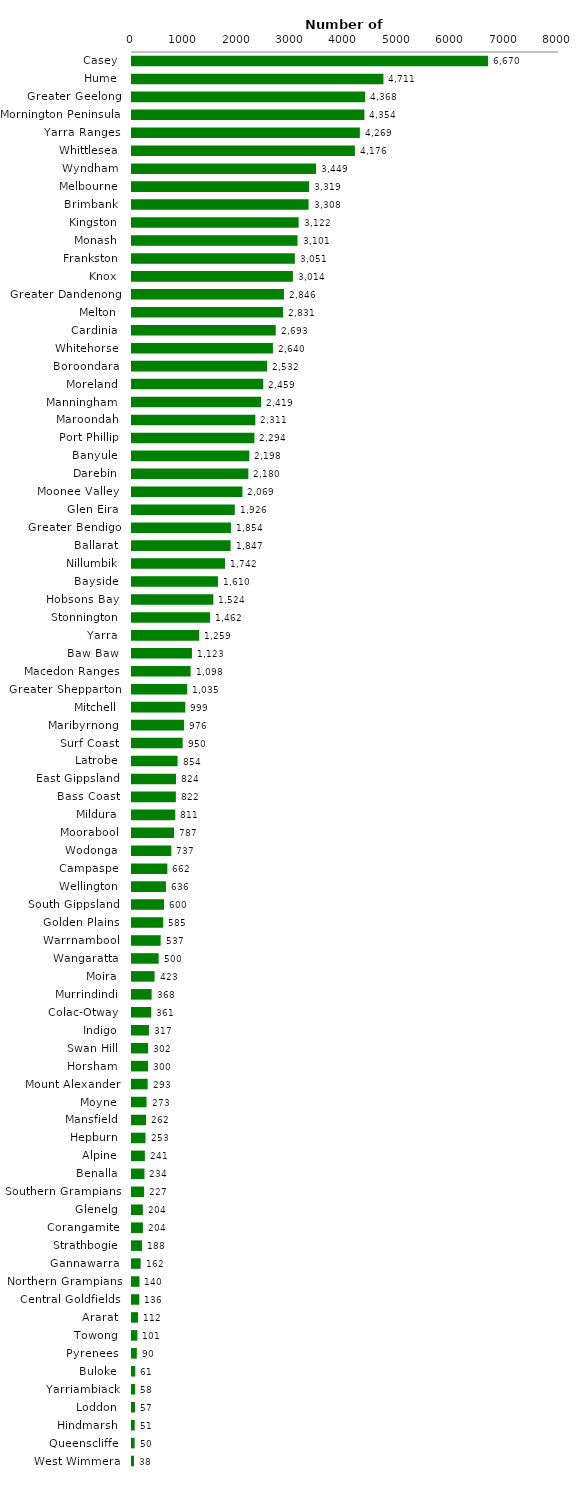
| Category | Series 0 |
|---|---|
| Casey  | 6670 |
| Hume  | 4711 |
| Greater Geelong  | 4368 |
| Mornington Peninsula  | 4354 |
| Yarra Ranges  | 4269 |
| Whittlesea  | 4176 |
| Wyndham  | 3449 |
| Melbourne  | 3319 |
| Brimbank  | 3308 |
| Kingston  | 3122 |
| Monash  | 3101 |
| Frankston  | 3051 |
| Knox  | 3014 |
| Greater Dandenong  | 2846 |
| Melton  | 2831 |
| Cardinia  | 2693 |
| Whitehorse  | 2640 |
| Boroondara  | 2532 |
| Moreland  | 2459 |
| Manningham  | 2419 |
| Maroondah  | 2311 |
| Port Phillip  | 2294 |
| Banyule  | 2198 |
| Darebin  | 2180 |
| Moonee Valley  | 2069 |
| Glen Eira  | 1926 |
| Greater Bendigo  | 1854 |
| Ballarat  | 1847 |
| Nillumbik  | 1742 |
| Bayside  | 1610 |
| Hobsons Bay  | 1524 |
| Stonnington  | 1462 |
| Yarra  | 1259 |
| Baw Baw  | 1123 |
| Macedon Ranges  | 1098 |
| Greater Shepparton  | 1035 |
| Mitchell  | 999 |
| Maribyrnong  | 976 |
| Surf Coast  | 950 |
| Latrobe  | 854 |
| East Gippsland  | 824 |
| Bass Coast  | 822 |
| Mildura  | 811 |
| Moorabool  | 787 |
| Wodonga  | 737 |
| Campaspe  | 662 |
| Wellington  | 636 |
| South Gippsland  | 600 |
| Golden Plains  | 585 |
| Warrnambool  | 537 |
| Wangaratta  | 500 |
| Moira  | 423 |
| Murrindindi  | 368 |
| Colac-Otway  | 361 |
| Indigo  | 317 |
| Swan Hill  | 302 |
| Horsham  | 300 |
| Mount Alexander  | 293 |
| Moyne  | 273 |
| Mansfield  | 262 |
| Hepburn  | 253 |
| Alpine  | 241 |
| Benalla  | 234 |
| Southern Grampians  | 227 |
| Glenelg  | 204 |
| Corangamite  | 204 |
| Strathbogie  | 188 |
| Gannawarra  | 162 |
| Northern Grampians  | 140 |
| Central Goldfields  | 136 |
| Ararat  | 112 |
| Towong  | 101 |
| Pyrenees  | 90 |
| Buloke  | 61 |
| Yarriambiack  | 58 |
| Loddon  | 57 |
| Hindmarsh  | 51 |
| Queenscliffe  | 50 |
| West Wimmera  | 38 |